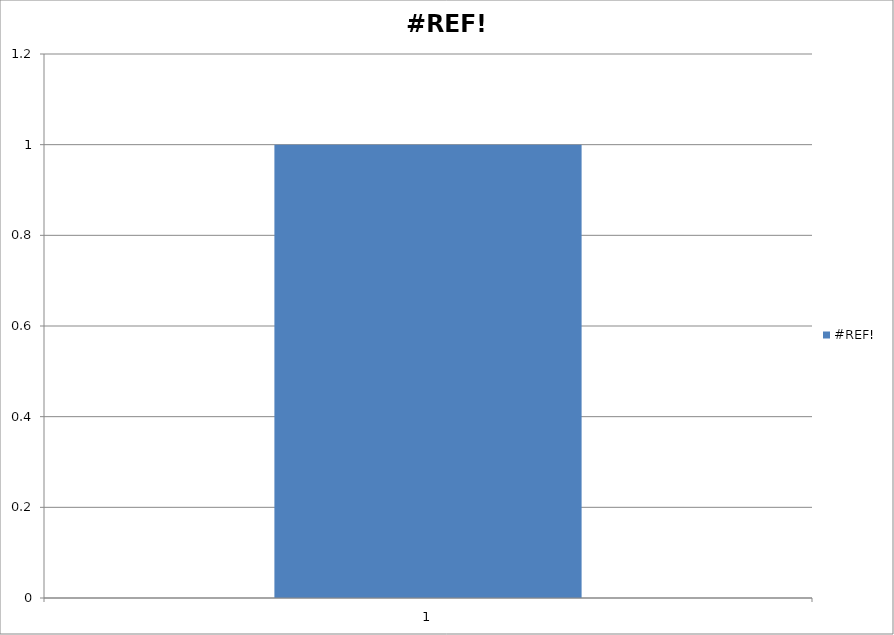
| Category | #REF! |
|---|---|
| 0 | 1 |